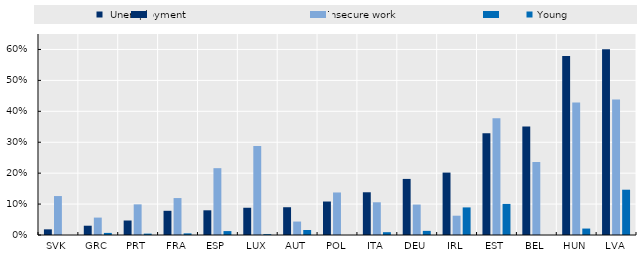
| Category |  Unemployment | Insecure work | Young |
|---|---|---|---|
| SVK | 0.018 | 0.126 | 0 |
| GRC | 0.03 | 0.056 | 0.007 |
| PRT | 0.047 | 0.099 | 0.004 |
| FRA | 0.078 | 0.119 | 0.005 |
| ESP | 0.08 | 0.216 | 0.013 |
| LUX | 0.088 | 0.288 | 0.003 |
| AUT | 0.09 | 0.043 | 0.016 |
| POL | 0.108 | 0.138 | -0.002 |
| ITA | 0.138 | 0.106 | 0.009 |
| DEU | 0.181 | 0.098 | 0.013 |
| IRL | 0.202 | 0.062 | 0.089 |
| EST | 0.329 | 0.378 | 0.101 |
| BEL | 0.351 | 0.236 | -0.024 |
| HUN | 0.579 | 0.429 | 0.021 |
| LVA | 0.6 | 0.438 | 0.146 |